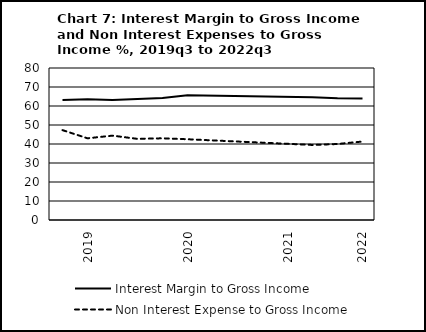
| Category | Interest Margin to Gross Income | Non Interest Expense to Gross Income |
|---|---|---|
| nan | 63.2 | 47.3 |
| 2019.0 | 63.5 | 43 |
| nan | 63.1 | 44.4 |
| nan | 63.7 | 42.7 |
| nan | 64.2 | 43 |
| 2020.0 | 65.7 | 42.5 |
| nan | 0 | 0 |
| nan | 0 | 0 |
| nan | 0 | 0 |
| 2021.0 | 0 | 0 |
| nan | 64.6 | 39.5 |
| nan | 64.1 | 40 |
| 2022.0 | 64 | 41.3 |